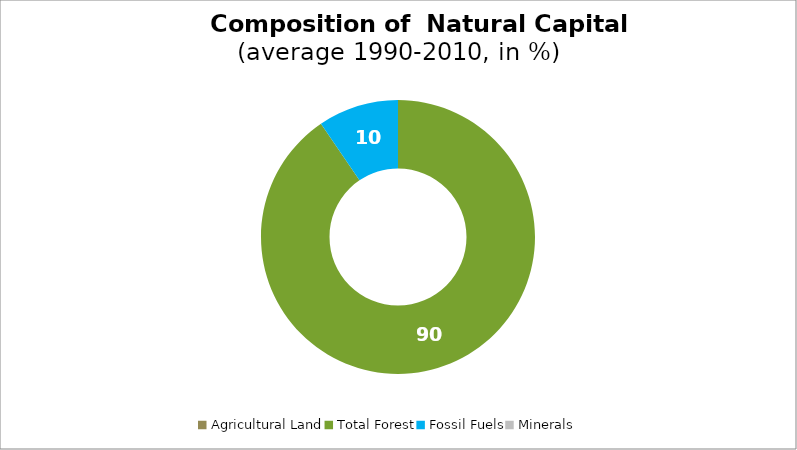
| Category | Series 0 |
|---|---|
| Agricultural Land | 0 |
| Total Forest | 90.495 |
| Fossil Fuels | 9.505 |
| Minerals | 0 |